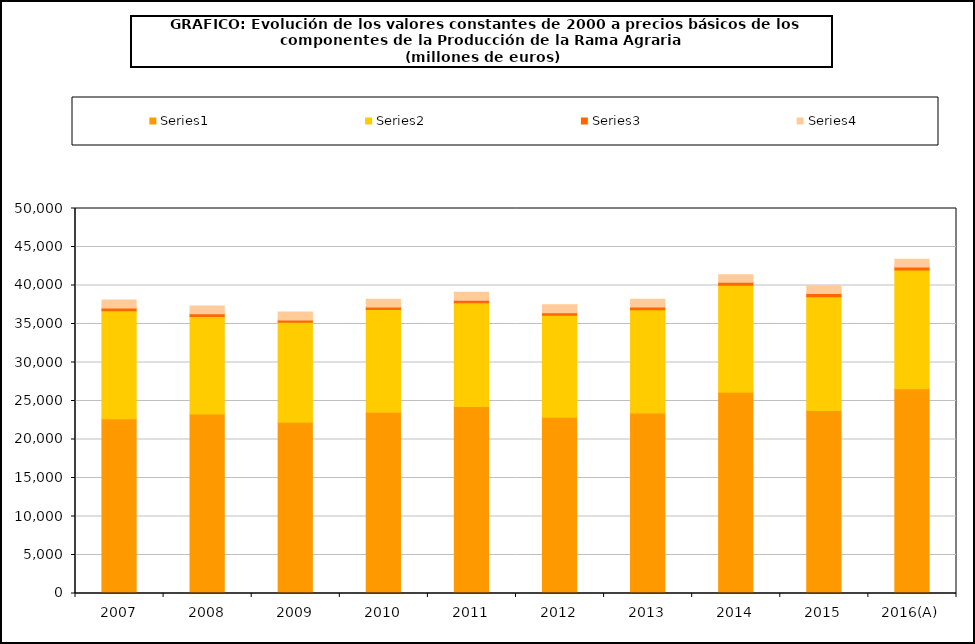
| Category | Series 1 | Series 2 | Series 3 | Series 4 |
|---|---|---|---|---|
| 2007 | 22693.4 | 14021.5 | 349.2 | 1051.5 |
| 2008 | 23322.7 | 12663.4 | 359.2 | 1000.2 |
| 2009 | 22241.2 | 12972.1 | 307.9 | 1025.1 |
| 2010 | 23535.5 | 13339.7 | 321.6 | 1033.4 |
| 2011 | 24269.6 | 13477 | 327.7 | 1034.7 |
| 2012 | 22902.1 | 13229.7 | 340.4 | 1032.7 |
| 2013 | 23433.2 | 13422.8 | 352 | 1014.7 |
| 2014 | 26123.1 | 13909.9 | 384 | 991.6 |
| 2015 | 23758.8 | 14795.1 | 402.1 | 1014.9 |
| 2016(A) | 26580.4 | 15422.1 | 406.5 | 1005.4 |